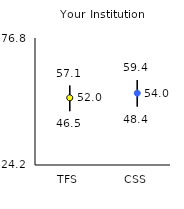
| Category | 25th | 75th | Mean |
|---|---|---|---|
| TFS | 46.5 | 57.1 | 52.03 |
| CSS | 48.4 | 59.4 | 53.97 |